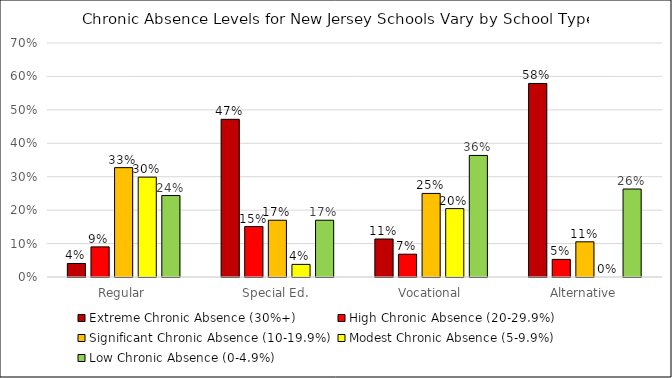
| Category | Extreme Chronic Absence (30%+) | High Chronic Absence (20-29.9%) | Significant Chronic Absence (10-19.9%) | Modest Chronic Absence (5-9.9%) | Low Chronic Absence (0-4.9%) |
|---|---|---|---|---|---|
| Regular | 0.04 | 0.09 | 0.327 | 0.299 | 0.244 |
| Special Ed. | 0.472 | 0.151 | 0.17 | 0.038 | 0.17 |
| Vocational | 0.114 | 0.068 | 0.25 | 0.205 | 0.364 |
| Alternative | 0.579 | 0.053 | 0.105 | 0 | 0.263 |